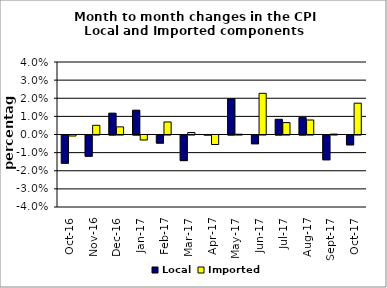
| Category | Local | Imported |
|---|---|---|
| 2016-10-01 | -0.016 | -0.001 |
| 2016-11-01 | -0.012 | 0.005 |
| 2016-12-01 | 0.012 | 0.004 |
| 2017-01-01 | 0.013 | -0.003 |
| 2017-02-01 | -0.004 | 0.007 |
| 2017-03-01 | -0.014 | 0.001 |
| 2017-04-01 | 0 | -0.005 |
| 2017-05-01 | 0.02 | 0 |
| 2017-06-01 | -0.005 | 0.023 |
| 2017-07-01 | 0.008 | 0.007 |
| 2017-08-01 | 0.009 | 0.008 |
| 2017-09-01 | -0.014 | 0 |
| 2017-10-01 | -0.005 | 0.017 |